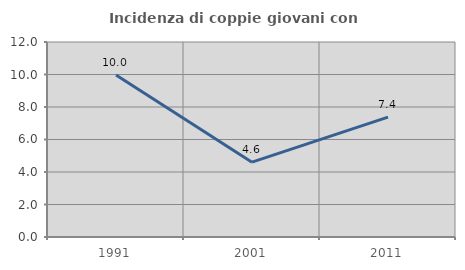
| Category | Incidenza di coppie giovani con figli |
|---|---|
| 1991.0 | 9.968 |
| 2001.0 | 4.605 |
| 2011.0 | 7.38 |